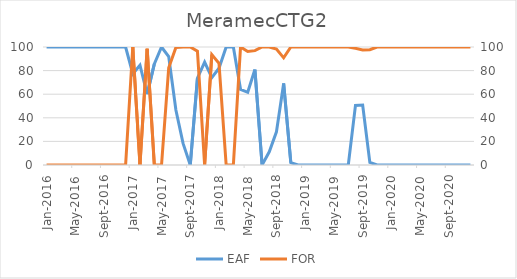
| Category | EAF |
|---|---|
| 2016-01-01 | 100 |
| 2016-02-01 | 100 |
| 2016-03-01 | 100 |
| 2016-04-01 | 100 |
| 2016-05-01 | 100 |
| 2016-06-01 | 100 |
| 2016-07-01 | 100 |
| 2016-08-01 | 100 |
| 2016-09-01 | 100 |
| 2016-10-01 | 100 |
| 2016-11-01 | 100 |
| 2016-12-01 | 100 |
| 2017-01-01 | 77.33 |
| 2017-02-01 | 84.53 |
| 2017-03-01 | 60.12 |
| 2017-04-01 | 85.63 |
| 2017-05-01 | 100 |
| 2017-06-01 | 91.84 |
| 2017-07-01 | 46.62 |
| 2017-08-01 | 18.29 |
| 2017-09-01 | 0 |
| 2017-10-01 | 73.61 |
| 2017-11-01 | 87.11 |
| 2017-12-01 | 73.96 |
| 2018-01-01 | 82 |
| 2018-02-01 | 100 |
| 2018-03-01 | 100 |
| 2018-04-01 | 64.13 |
| 2018-05-01 | 61.63 |
| 2018-06-01 | 80.92 |
| 2018-07-01 | 0 |
| 2018-08-01 | 11.16 |
| 2018-09-01 | 28.15 |
| 2018-10-01 | 69.14 |
| 2018-11-01 | 1.95 |
| 2018-12-01 | 0 |
| 2019-01-01 | 0 |
| 2019-02-01 | 0 |
| 2019-03-01 | 0 |
| 2019-04-01 | 0 |
| 2019-05-01 | 0 |
| 2019-06-01 | 0 |
| 2019-07-01 | 0 |
| 2019-08-01 | 50.48 |
| 2019-09-01 | 50.75 |
| 2019-10-01 | 2.21 |
| 2019-11-01 | 0 |
| 2019-12-01 | 0 |
| 2020-01-01 | 0 |
| 2020-02-01 | 0 |
| 2020-03-01 | 0 |
| 2020-04-01 | 0 |
| 2020-05-01 | 0 |
| 2020-06-01 | 0 |
| 2020-07-01 | 0 |
| 2020-08-01 | 0 |
| 2020-09-01 | 0 |
| 2020-10-01 | 0 |
| 2020-11-01 | 0 |
| 2020-12-01 | 0 |